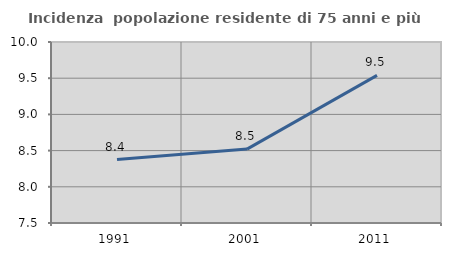
| Category | Incidenza  popolazione residente di 75 anni e più |
|---|---|
| 1991.0 | 8.376 |
| 2001.0 | 8.52 |
| 2011.0 | 9.54 |